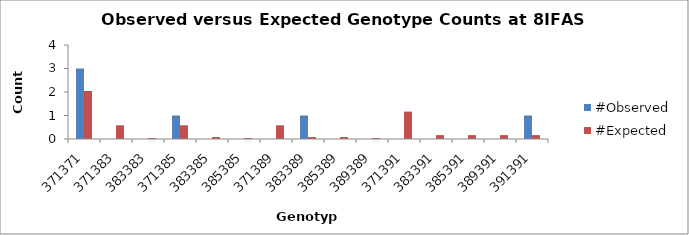
| Category | #Observed | #Expected |
|---|---|---|
| 371371.0 | 3 | 2.042 |
| 371383.0 | 0 | 0.583 |
| 383383.0 | 0 | 0.042 |
| 371385.0 | 1 | 0.583 |
| 383385.0 | 0 | 0.083 |
| 385385.0 | 0 | 0.042 |
| 371389.0 | 0 | 0.583 |
| 383389.0 | 1 | 0.083 |
| 385389.0 | 0 | 0.083 |
| 389389.0 | 0 | 0.042 |
| 371391.0 | 0 | 1.167 |
| 383391.0 | 0 | 0.167 |
| 385391.0 | 0 | 0.167 |
| 389391.0 | 0 | 0.167 |
| 391391.0 | 1 | 0.167 |